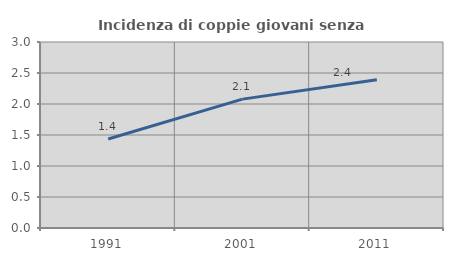
| Category | Incidenza di coppie giovani senza figli |
|---|---|
| 1991.0 | 1.435 |
| 2001.0 | 2.079 |
| 2011.0 | 2.391 |